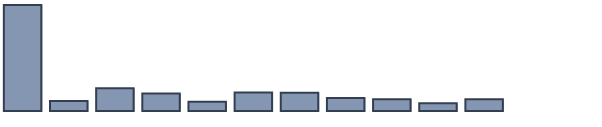
| Category | Series 0 |
|---|---|
| 0 | 43 |
| 1 | 4.1 |
| 2 | 9.2 |
| 3 | 7.1 |
| 4 | 3.7 |
| 5 | 7.5 |
| 6 | 7.4 |
| 7 | 5.3 |
| 8 | 4.8 |
| 9 | 3.1 |
| 10 | 4.8 |
| 11 | 0 |
| 12 | 0 |